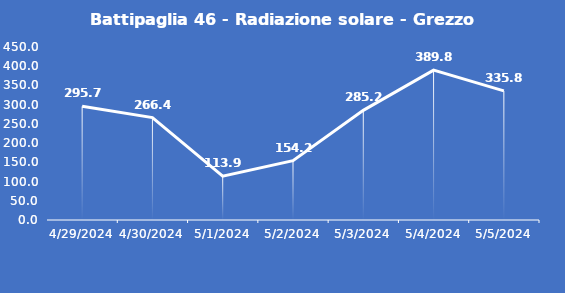
| Category | Battipaglia 46 - Radiazione solare - Grezzo (W/m2) |
|---|---|
| 4/29/24 | 295.7 |
| 4/30/24 | 266.4 |
| 5/1/24 | 113.9 |
| 5/2/24 | 154.2 |
| 5/3/24 | 285.2 |
| 5/4/24 | 389.8 |
| 5/5/24 | 335.8 |